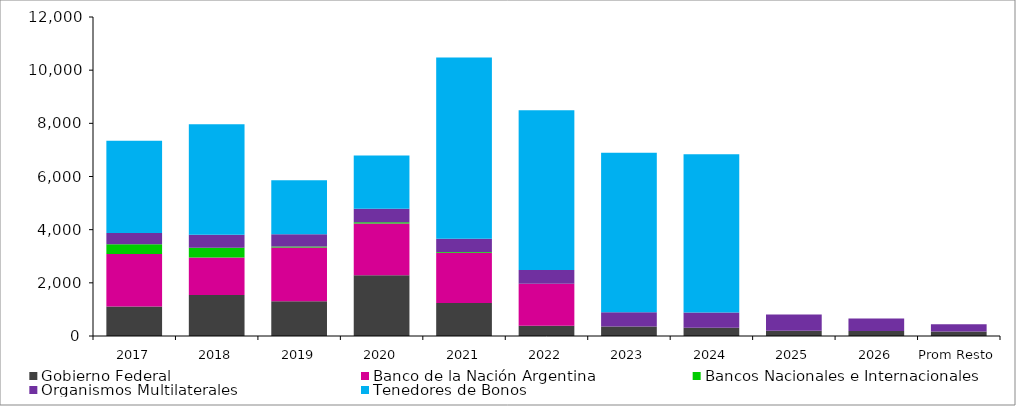
| Category | Gobierno Federal | Banco de la Nación Argentina | Bancos Nacionales e Internacionales | Organismos Multilaterales | Tenedores de Bonos |
|---|---|---|---|---|---|
| 2017 | 1105.27 | 1977.482 | 367.434 | 421.759 | 3473.565 |
| 2018 | 1540.414 | 1413.944 | 368.965 | 482.815 | 4162.791 |
| 2019 | 1308.17 | 2019.863 | 39.034 | 463.212 | 2031.543 |
| 2020 | 2289.838 | 1944.817 | 41.815 | 509.355 | 2007.972 |
| 2021 | 1239.589 | 1896.416 | 21.655 | 504.887 | 6809.856 |
| 2022 | 388.807 | 1573.019 | 0 | 524.427 | 6002.087 |
| 2023 | 352.99 | 0 | 0 | 542.752 | 5998.279 |
| 2024 | 313.301 | 0 | 0 | 570.167 | 5958.059 |
| 2025 | 195.231 | 0 | 0 | 609.97 | 0 |
| 2026 | 187.776 | 0 | 0 | 469.658 | 0 |
| Prom Resto | 171.268 | 0 | 0 | 270.868 | 0 |